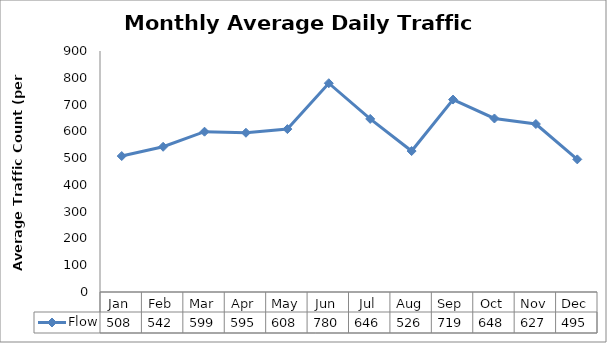
| Category | Flow |
|---|---|
| Jan | 507.667 |
| Feb | 542.333 |
| Mar | 598.667 |
| Apr | 594.667 |
| May | 608.333 |
| Jun | 779.667 |
| Jul | 646.333 |
| Aug | 526.333 |
| Sep | 718.667 |
| Oct | 648 |
| Nov | 627.333 |
| Dec | 495.333 |